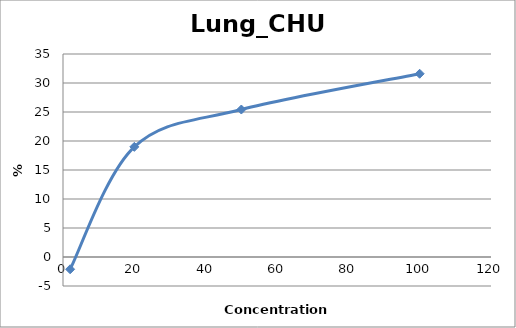
| Category | Lung_CHU2 |
|---|---|
| 100.0 | 31.593 |
| 50.0 | 25.428 |
| 20.0 | 18.992 |
| 2.0 | -2.115 |
| nan | 0 |
| nan | 0 |
| nan | 0 |
| nan | 0 |
| nan | 0 |